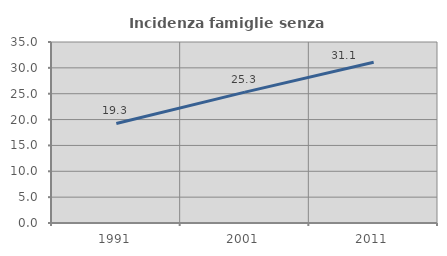
| Category | Incidenza famiglie senza nuclei |
|---|---|
| 1991.0 | 19.253 |
| 2001.0 | 25.305 |
| 2011.0 | 31.086 |